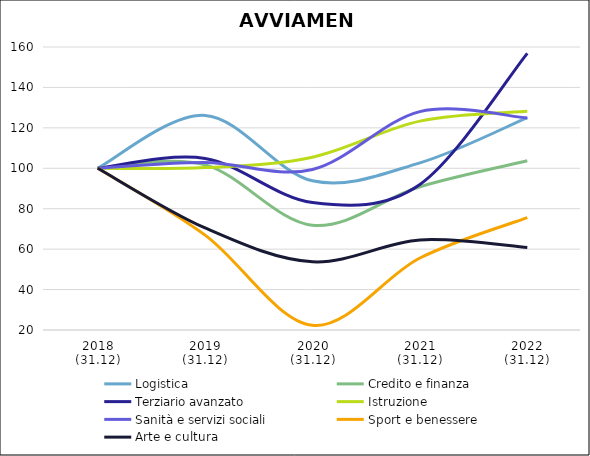
| Category | Logistica | Credito e finanza | Terziario avanzato | Istruzione | Sanità e servizi sociali | Sport e benessere | Arte e cultura |
|---|---|---|---|---|---|---|---|
| 2018
(31.12) | 100 | 100 | 100 | 100 | 100 | 100 | 100 |
| 2019
(31.12) | 126.157 | 101.709 | 104.862 | 100.352 | 102.881 | 66.928 | 70.469 |
| 2020
(31.12) | 93.796 | 71.795 | 83.032 | 105.5 | 99.432 | 22.309 | 53.761 |
| 2021
(31.12) | 102.693 | 90.883 | 92.002 | 123.347 | 128.048 | 55.605 | 64.55 |
| 2022
(31.12) | 125.071 | 103.704 | 156.837 | 128.194 | 124.873 | 75.561 | 60.789 |